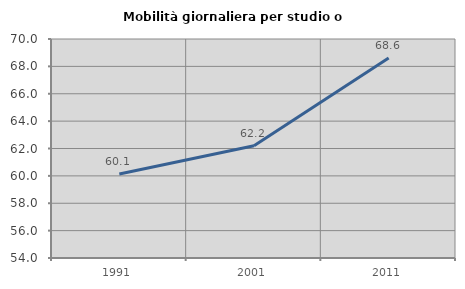
| Category | Mobilità giornaliera per studio o lavoro |
|---|---|
| 1991.0 | 60.131 |
| 2001.0 | 62.204 |
| 2011.0 | 68.608 |